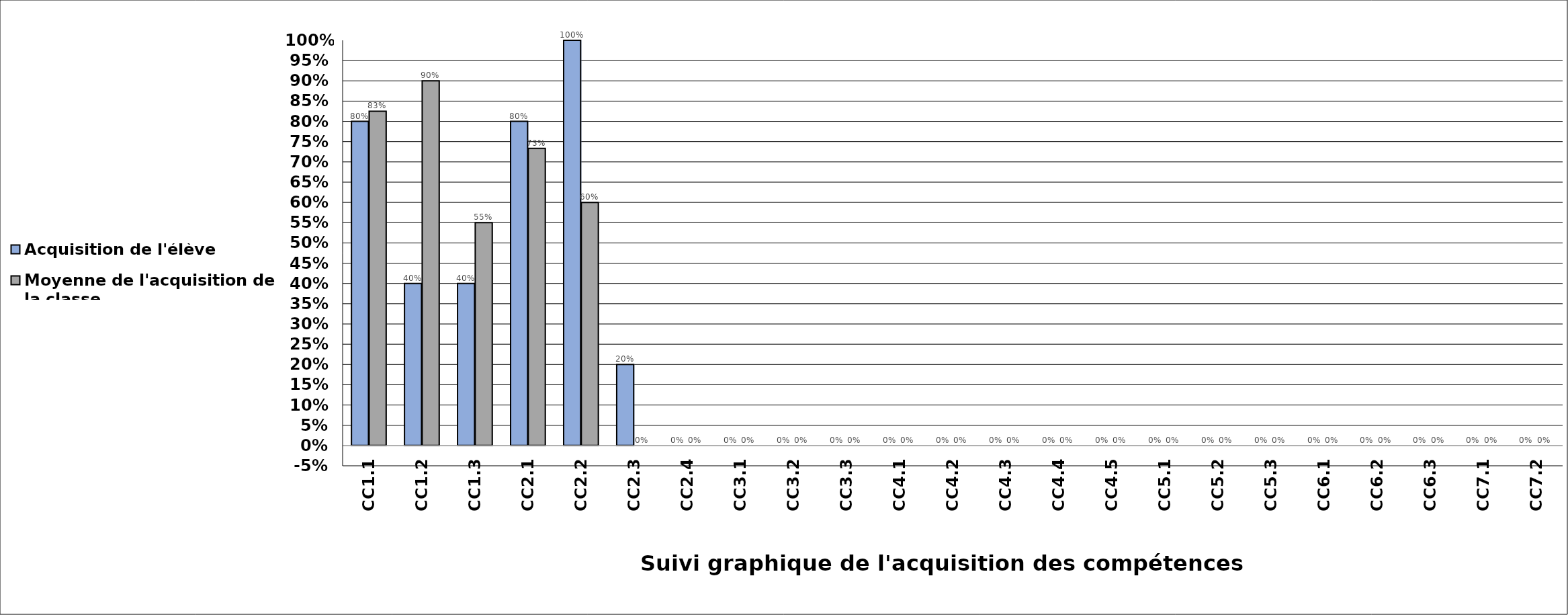
| Category | Acquisition de l'élève | Moyenne de l'acquisition de la classe |
|---|---|---|
| CC1.1 | 0.8 | 0.825 |
| CC1.2 | 0.4 | 0.9 |
| CC1.3 | 0.4 | 0.55 |
| CC2.1 | 0.8 | 0.733 |
| CC2.2 | 1 | 0.6 |
| CC2.3 | 0.2 | 0 |
| CC2.4 | 0 | 0 |
| CC3.1 | 0 | 0 |
| CC3.2 | 0 | 0 |
| CC3.3 | 0 | 0 |
| CC4.1 | 0 | 0 |
| CC4.2 | 0 | 0 |
| CC4.3 | 0 | 0 |
| CC4.4 | 0 | 0 |
| CC4.5 | 0 | 0 |
| CC5.1 | 0 | 0 |
| CC5.2 | 0 | 0 |
| CC5.3 | 0 | 0 |
| CC6.1 | 0 | 0 |
| CC6.2 | 0 | 0 |
| CC6.3 | 0 | 0 |
| CC7.1 | 0 | 0 |
| CC7.2 | 0 | 0 |